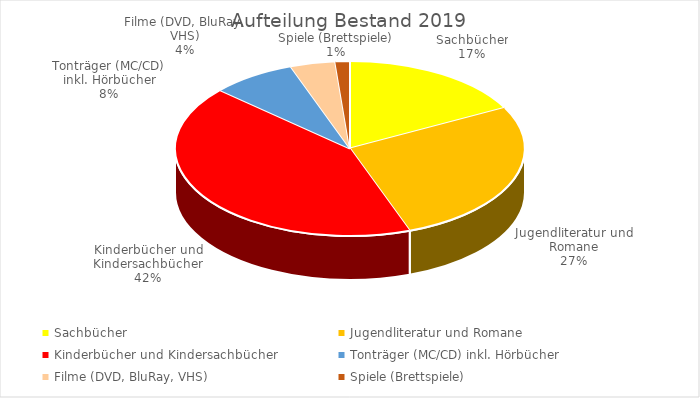
| Category | Series 0 |
|---|---|
| Sachbücher | 1218 |
| Jugendliteratur und Romane | 1912 |
| Kinderbücher und Kindersachbücher | 2970 |
| Tonträger (MC/CD) inkl. Hörbücher | 551 |
| Filme (DVD, BluRay, VHS) | 294 |
| Spiele (Brettspiele) | 95 |